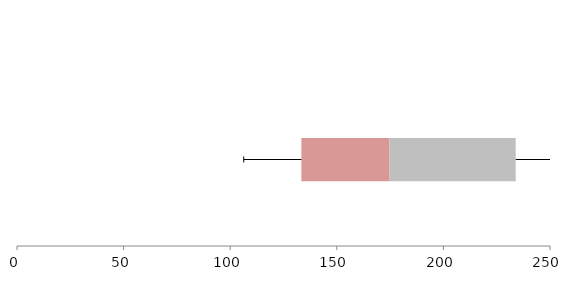
| Category | Series 1 | Series 2 | Series 3 |
|---|---|---|---|
| 0 | 133.38 | 41.227 | 59.306 |